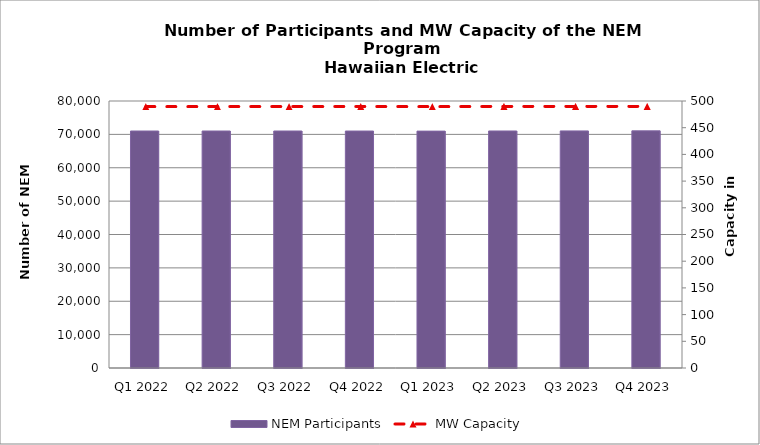
| Category | NEM Participants |
|---|---|
| Q1 2022 | 71007 |
| Q2 2022 | 71007 |
| Q3 2022 | 71008 |
| Q4 2022 | 70999 |
| Q1 2023 | 70977 |
| Q2 2023 | 71019 |
| Q3 2023 | 71036 |
| Q4 2023 | 71058 |